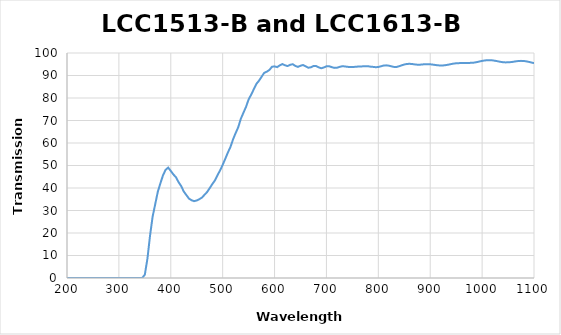
| Category | Series 0 |
|---|---|
| 1100.0 | 95.488 |
| 1095.0 | 95.779 |
| 1090.0 | 96.048 |
| 1085.0 | 96.289 |
| 1080.0 | 96.465 |
| 1075.0 | 96.505 |
| 1070.0 | 96.448 |
| 1065.0 | 96.293 |
| 1060.0 | 96.091 |
| 1055.0 | 95.946 |
| 1050.0 | 95.849 |
| 1045.0 | 95.823 |
| 1040.0 | 95.915 |
| 1035.0 | 96.088 |
| 1030.0 | 96.332 |
| 1025.0 | 96.546 |
| 1020.0 | 96.725 |
| 1015.0 | 96.805 |
| 1010.0 | 96.8 |
| 1005.0 | 96.68 |
| 1000.0 | 96.484 |
| 995.0 | 96.236 |
| 990.0 | 95.964 |
| 985.0 | 95.742 |
| 980.0 | 95.624 |
| 975.0 | 95.601 |
| 970.0 | 95.577 |
| 965.0 | 95.588 |
| 960.0 | 95.569 |
| 955.0 | 95.484 |
| 950.0 | 95.437 |
| 945.0 | 95.281 |
| 940.0 | 95.067 |
| 935.0 | 94.813 |
| 930.0 | 94.622 |
| 925.0 | 94.477 |
| 920.0 | 94.465 |
| 915.0 | 94.516 |
| 910.0 | 94.669 |
| 905.0 | 94.833 |
| 900.0 | 94.993 |
| 895.0 | 95.021 |
| 890.0 | 94.982 |
| 885.0 | 94.929 |
| 880.0 | 94.789 |
| 875.0 | 94.809 |
| 870.0 | 94.932 |
| 865.0 | 95.104 |
| 860.0 | 95.2 |
| 855.0 | 95.122 |
| 850.0 | 94.899 |
| 845.0 | 94.525 |
| 840.0 | 94.117 |
| 835.0 | 93.779 |
| 830.0 | 93.818 |
| 825.0 | 94.083 |
| 820.0 | 94.381 |
| 815.0 | 94.512 |
| 810.0 | 94.417 |
| 805.0 | 94.09 |
| 800.0 | 93.771 |
| 795.0 | 93.689 |
| 790.0 | 93.825 |
| 785.0 | 93.927 |
| 780.0 | 94.116 |
| 775.0 | 94.139 |
| 770.0 | 94.082 |
| 765.0 | 93.957 |
| 760.0 | 93.953 |
| 755.0 | 93.844 |
| 750.0 | 93.789 |
| 745.0 | 93.763 |
| 740.0 | 93.869 |
| 735.0 | 94.049 |
| 730.0 | 94.088 |
| 725.0 | 93.797 |
| 720.0 | 93.441 |
| 715.0 | 93.39 |
| 710.0 | 93.736 |
| 705.0 | 94.129 |
| 700.0 | 94.077 |
| 695.0 | 93.573 |
| 690.0 | 93.219 |
| 685.0 | 93.633 |
| 680.0 | 94.198 |
| 675.0 | 94.199 |
| 670.0 | 93.641 |
| 665.0 | 93.456 |
| 660.0 | 94.065 |
| 655.0 | 94.667 |
| 650.0 | 94.339 |
| 645.0 | 93.825 |
| 640.0 | 94.262 |
| 635.0 | 95.02 |
| 630.0 | 94.743 |
| 625.0 | 94.202 |
| 620.0 | 94.549 |
| 615.0 | 95.094 |
| 610.0 | 94.499 |
| 605.0 | 93.733 |
| 600.0 | 94.06 |
| 595.0 | 93.873 |
| 590.0 | 92.438 |
| 585.0 | 91.69 |
| 580.0 | 91.17 |
| 575.0 | 89.438 |
| 570.0 | 87.672 |
| 565.0 | 86.283 |
| 560.0 | 83.908 |
| 555.0 | 81.504 |
| 550.0 | 79.363 |
| 545.0 | 76.048 |
| 540.0 | 73.448 |
| 535.0 | 70.762 |
| 530.0 | 67.002 |
| 525.0 | 64.409 |
| 520.0 | 61.615 |
| 515.0 | 58.229 |
| 510.0 | 55.747 |
| 505.0 | 52.957 |
| 500.0 | 50.286 |
| 495.0 | 47.784 |
| 490.0 | 45.686 |
| 485.0 | 43.338 |
| 480.0 | 41.734 |
| 475.0 | 39.921 |
| 470.0 | 38.211 |
| 465.0 | 36.982 |
| 460.0 | 35.721 |
| 455.0 | 35.03 |
| 450.0 | 34.456 |
| 445.0 | 34.153 |
| 440.0 | 34.572 |
| 435.0 | 35.297 |
| 430.0 | 36.881 |
| 425.0 | 38.438 |
| 420.0 | 40.899 |
| 415.0 | 42.601 |
| 410.0 | 44.763 |
| 405.0 | 46.039 |
| 400.0 | 47.595 |
| 395.0 | 49.073 |
| 390.0 | 48.076 |
| 385.0 | 45.623 |
| 380.0 | 42.111 |
| 375.0 | 38.327 |
| 370.0 | 32.795 |
| 365.0 | 27.268 |
| 360.0 | 18.772 |
| 355.0 | 8.588 |
| 350.0 | 1.493 |
| 345.0 | 0.008 |
| 340.0 | -0.004 |
| 335.0 | -0.01 |
| 330.0 | -0.012 |
| 325.0 | -0.016 |
| 320.0 | -0.016 |
| 315.0 | -0.009 |
| 310.0 | -0.001 |
| 305.0 | 0.002 |
| 300.0 | -0.001 |
| 295.0 | 0 |
| 290.0 | 0.005 |
| 285.0 | 0.004 |
| 280.0 | 0.004 |
| 275.0 | 0 |
| 270.0 | -0.004 |
| 265.0 | -0.005 |
| 260.0 | -0.006 |
| 255.0 | 0.001 |
| 250.0 | 0 |
| 245.0 | 0.003 |
| 240.0 | -0.005 |
| 235.0 | -0.007 |
| 230.0 | -0.007 |
| 225.0 | -0.01 |
| 220.0 | -0.015 |
| 215.0 | -0.021 |
| 210.0 | -0.021 |
| 205.0 | -0.029 |
| 200.0 | -0.048 |